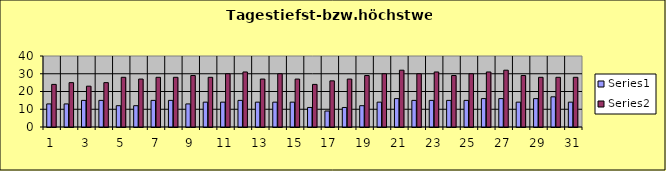
| Category | Series 0 | Series 1 |
|---|---|---|
| 0 | 13 | 24 |
| 1 | 13 | 25 |
| 2 | 15 | 23 |
| 3 | 15 | 25 |
| 4 | 12 | 28 |
| 5 | 12 | 27 |
| 6 | 15 | 28 |
| 7 | 15 | 28 |
| 8 | 13 | 29 |
| 9 | 14 | 28 |
| 10 | 14 | 30 |
| 11 | 15 | 31 |
| 12 | 14 | 27 |
| 13 | 14 | 30 |
| 14 | 14 | 27 |
| 15 | 11 | 24 |
| 16 | 9 | 26 |
| 17 | 11 | 27 |
| 18 | 12 | 29 |
| 19 | 14 | 30 |
| 20 | 16 | 32 |
| 21 | 15 | 30 |
| 22 | 15 | 31 |
| 23 | 15 | 29 |
| 24 | 15 | 30 |
| 25 | 16 | 31 |
| 26 | 16 | 32 |
| 27 | 14 | 29 |
| 28 | 16 | 28 |
| 29 | 17 | 28 |
| 30 | 14 | 28 |